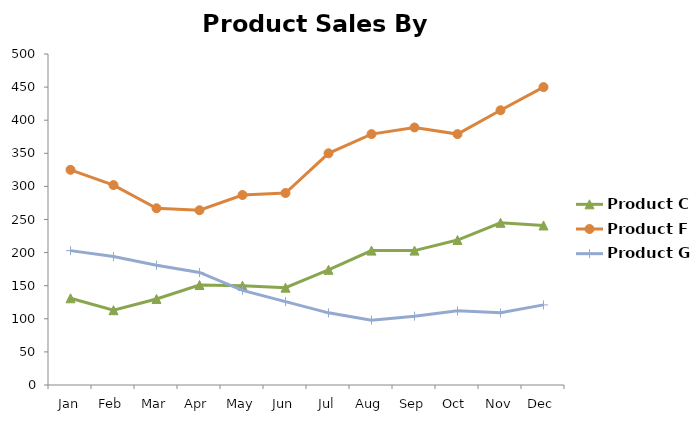
| Category | Product A | Product B | Product C | Product D | Product E | Product F | Product G |
|---|---|---|---|---|---|---|---|
| Jan |  |  | 131 |  |  | 325 | 203 |
| Feb |  |  | 113 |  |  | 302 | 194 |
| Mar |  |  | 130 |  |  | 267 | 181 |
| Apr |  |  | 151 |  |  | 264 | 170 |
| May |  |  | 150 |  |  | 287 | 143 |
| Jun |  |  | 147 |  |  | 290 | 126 |
| Jul |  |  | 174 |  |  | 350 | 109 |
| Aug |  |  | 203 |  |  | 379 | 98 |
| Sep |  |  | 203 |  |  | 389 | 104 |
| Oct |  |  | 219 |  |  | 379 | 112 |
| Nov |  |  | 245 |  |  | 415 | 109 |
| Dec |  |  | 241 |  |  | 450 | 121 |